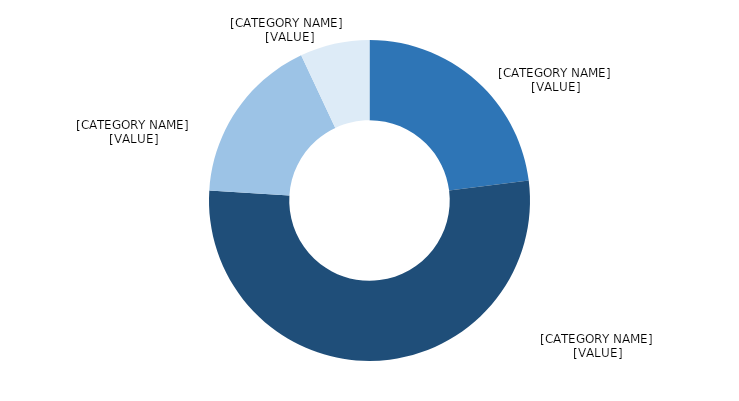
| Category | Series 0 |
|---|---|
| Europe (49 countries) | 0.23 |
| Asia and the Pacific (65 countries) | 0.53 |
| Americas (44 countries) | 0.17 |
| Africa (56 countries) | 0.07 |